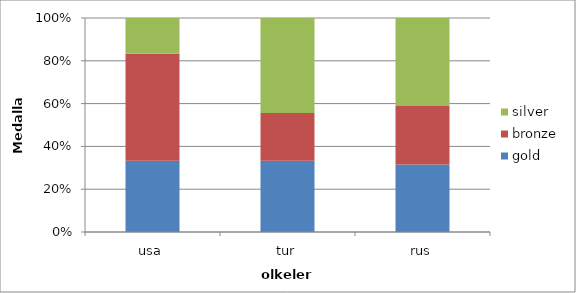
| Category | gold | bronze | silver |
|---|---|---|---|
| usa | 100 | 150 | 50 |
| tur | 75 | 50 | 100 |
| rus | 115 | 100 | 150 |